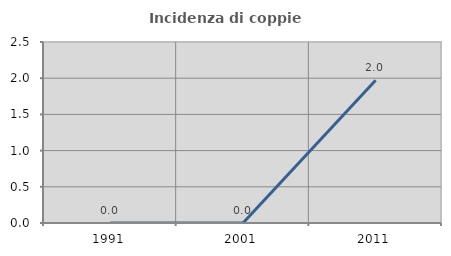
| Category | Incidenza di coppie miste |
|---|---|
| 1991.0 | 0 |
| 2001.0 | 0 |
| 2011.0 | 1.97 |